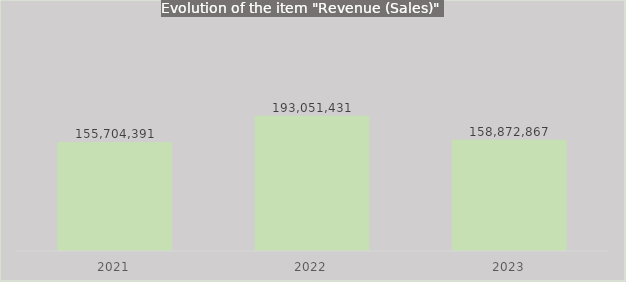
| Category | Series 0 |
|---|---|
| 2021.0 | 155704391 |
| 2022.0 | 193051430.641 |
| 2023.0 | 158872866.675 |